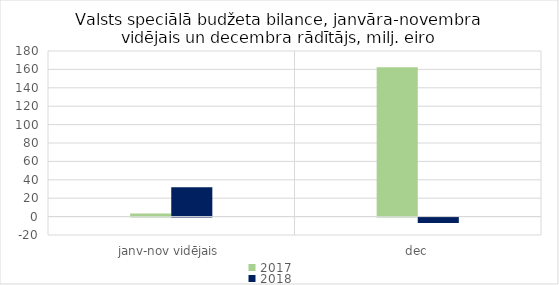
| Category | 2017 | 2018 |
|---|---|---|
| janv-nov vidējais | 3478.906 | 31770.448 |
| dec | 162256.524 | -5948.69 |